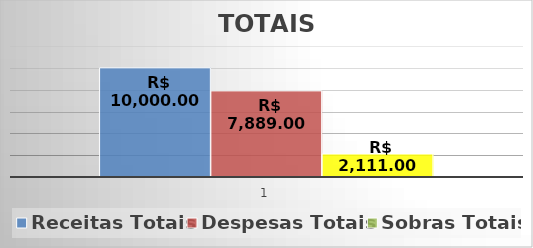
| Category | Receitas Totais | Despesas Totais | Sobras Totais |
|---|---|---|---|
| 0 | 10000 | 7889 | 2111 |